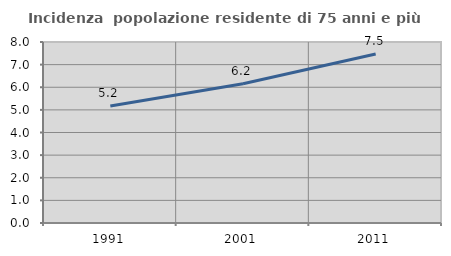
| Category | Incidenza  popolazione residente di 75 anni e più |
|---|---|
| 1991.0 | 5.169 |
| 2001.0 | 6.154 |
| 2011.0 | 7.472 |